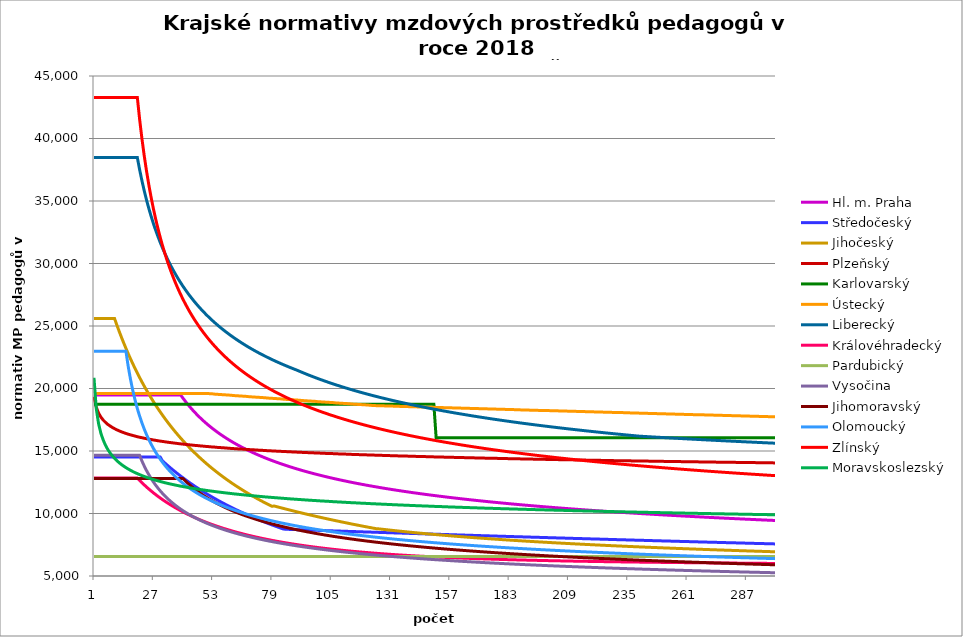
| Category | Hl. m. Praha | Středočeský | Jihočeský | Plzeňský | Karlovarský  | Ústecký   | Liberecký | Královéhradecký | Pardubický | Vysočina | Jihomoravský | Olomoucký | Zlínský | Moravskoslezský |
|---|---|---|---|---|---|---|---|---|---|---|---|---|---|---|
| 0 | 19479.538 | 14525.257 | 25604.931 | 19341.812 | 18733.333 | 19607.702 | 38475.29 | 12832.799 | 6567.12 | 14650.174 | 12794.049 | 22978.421 | 43279.031 | 20856.298 |
| 1 | 19479.538 | 14525.257 | 25604.931 | 18498.733 | 18733.333 | 19607.702 | 38475.29 | 12832.799 | 6567.12 | 14650.174 | 12794.049 | 22978.421 | 43279.031 | 18378.322 |
| 2 | 19479.538 | 14525.257 | 25604.931 | 18032.609 | 18733.333 | 19607.702 | 38475.29 | 12832.799 | 6567.12 | 14650.174 | 12794.049 | 22978.421 | 43279.031 | 17187.135 |
| 3 | 19479.538 | 14525.257 | 25604.931 | 17717.476 | 18733.333 | 19607.702 | 38475.29 | 12832.799 | 6567.12 | 14650.174 | 12794.049 | 22978.421 | 43279.031 | 16434.296 |
| 4 | 19479.538 | 14525.257 | 25604.931 | 17479.885 | 18733.333 | 19607.702 | 38475.29 | 12832.799 | 6567.12 | 14650.174 | 12794.049 | 22978.421 | 43279.031 | 15893.646 |
| 5 | 19479.538 | 14525.257 | 25604.931 | 17297.63 | 18733.333 | 19607.702 | 38475.29 | 12832.799 | 6567.12 | 14650.174 | 12794.049 | 22978.421 | 43279.031 | 15475.208 |
| 6 | 19479.538 | 14525.257 | 25604.931 | 17135.211 | 18733.333 | 19607.702 | 38475.29 | 12832.799 | 6567.12 | 14650.174 | 12794.049 | 22978.421 | 43279.031 | 15136.481 |
| 7 | 19479.538 | 14525.257 | 25604.931 | 17007.456 | 18733.333 | 19607.702 | 38475.29 | 12832.799 | 6567.12 | 14650.174 | 12794.049 | 22978.421 | 43279.031 | 14855.939 |
| 8 | 19479.538 | 14525.257 | 25604.931 | 16889.403 | 18733.333 | 19607.702 | 38475.29 | 12832.799 | 6567.12 | 14650.174 | 12794.049 | 22978.421 | 43279.031 | 14621.891 |
| 9 | 19479.538 | 14525.257 | 25604.931 | 16788.408 | 18733.333 | 19607.702 | 38475.29 | 12832.799 | 6567.12 | 14650.174 | 12794.049 | 22978.421 | 43279.031 | 14412.75 |
| 10 | 19479.538 | 14525.257 | 25088.177 | 16696.249 | 18733.333 | 19607.702 | 38475.29 | 12832.799 | 6567.12 | 14650.174 | 12794.049 | 22978.421 | 43279.031 | 14232.446 |
| 11 | 19479.538 | 14525.257 | 24591.867 | 16612.654 | 18733.333 | 19607.702 | 38475.29 | 12832.799 | 6567.12 | 14650.174 | 12794.049 | 22978.421 | 43279.031 | 14067.81 |
| 12 | 19479.538 | 14525.257 | 24114.814 | 16537.381 | 18733.333 | 19607.702 | 38475.29 | 12832.799 | 6567.12 | 14650.174 | 12794.049 | 22978.421 | 43279.031 | 13923.411 |
| 13 | 19479.538 | 14525.257 | 23655.917 | 16470.217 | 18733.333 | 19607.702 | 38475.29 | 12832.799 | 6567.12 | 14650.174 | 12794.049 | 22978.421 | 43279.031 | 13792.726 |
| 14 | 19479.538 | 14525.257 | 23214.159 | 16403.596 | 18733.333 | 19607.702 | 38475.29 | 12832.799 | 6567.12 | 14650.174 | 12794.049 | 22978.421 | 43279.031 | 13669.767 |
| 15 | 19479.538 | 14525.257 | 22788.597 | 16344.828 | 18733.333 | 19607.702 | 38475.29 | 12832.799 | 6567.12 | 14650.174 | 12794.049 | 21761.495 | 43279.031 | 13559.4 |
| 16 | 19479.538 | 14525.257 | 22378.358 | 16293.75 | 18733.333 | 19607.702 | 38475.29 | 12832.799 | 6567.12 | 14650.174 | 12794.049 | 20740.618 | 43279.031 | 13455.933 |
| 17 | 19479.538 | 14525.257 | 21982.627 | 16242.991 | 18733.333 | 19607.702 | 38475.29 | 12832.799 | 6567.12 | 14650.174 | 12794.049 | 19845 | 43279.031 | 13359.091 |
| 18 | 19479.538 | 14525.257 | 21600.649 | 16192.547 | 18733.333 | 19607.702 | 38475.29 | 12832.799 | 6567.12 | 14650.174 | 12794.049 | 19075.478 | 43279.031 | 13268.623 |
| 19 | 19479.538 | 14525.257 | 21231.72 | 16142.415 | 18733.333 | 19607.702 | 38475.29 | 12832.799 | 6567.12 | 14650.174 | 12794.049 | 18392.417 | 43279.031 | 13189.23 |
| 20 | 19479.538 | 14525.257 | 20875.181 | 16099.691 | 18733.333 | 19607.702 | 37510.962 | 12644.289 | 6567.12 | 14650.174 | 12794.049 | 17792.766 | 41540.661 | 13110.781 |
| 21 | 19479.538 | 14525.257 | 20530.418 | 16064.261 | 18733.333 | 19607.702 | 36635.47 | 12465.749 | 6567.12 | 14206.212 | 12794.049 | 17256.522 | 40008.432 | 13033.259 |
| 22 | 19479.538 | 14525.257 | 20196.859 | 16021.949 | 18733.333 | 19607.702 | 35836.251 | 12292.181 | 6567.12 | 13806.995 | 12794.049 | 16767.739 | 38646.336 | 12966.176 |
| 23 | 19479.538 | 14525.257 | 19873.965 | 15986.859 | 18733.333 | 19607.702 | 35103.059 | 12123.38 | 6567.12 | 13444.745 | 12794.049 | 16328.752 | 37426.384 | 12899.781 |
| 24 | 19479.538 | 14525.257 | 19561.233 | 15951.923 | 18733.333 | 19607.702 | 34427.448 | 11963.308 | 6567.12 | 13114.949 | 12794.049 | 15926.676 | 36326.481 | 12834.061 |
| 25 | 19479.538 | 14525.257 | 19258.19 | 15917.139 | 18733.333 | 19607.702 | 33802.39 | 11811.458 | 6567.12 | 12812.867 | 12794.049 | 15564.706 | 35328.946 | 12773.633 |
| 26 | 19479.538 | 14525.257 | 18964.394 | 15882.507 | 18733.333 | 19607.702 | 33221.985 | 11659.465 | 6567.12 | 12534.922 | 12794.049 | 15225.458 | 34419.453 | 12718.356 |
| 27 | 19479.538 | 14525.257 | 18679.427 | 15854.909 | 18733.333 | 19607.702 | 32681.241 | 11519.036 | 6567.12 | 12278.466 | 12794.049 | 14913.407 | 33586.271 | 12663.555 |
| 28 | 19479.538 | 14525.257 | 18402.898 | 15820.546 | 18733.333 | 19607.702 | 32175.904 | 11378.189 | 6567.12 | 12040.395 | 12794.049 | 14626.131 | 32819.696 | 12613.734 |
| 29 | 19479.538 | 14525.257 | 18134.436 | 15793.163 | 18733.333 | 19607.702 | 31702.323 | 11244.415 | 6567.12 | 11819.185 | 12794.049 | 14355.61 | 32111.627 | 12564.304 |
| 30 | 19479.538 | 14211.256 | 17873.695 | 15765.875 | 18733.333 | 19607.702 | 31257.349 | 11117.339 | 6567.12 | 11613.117 | 12794.049 | 14106.3 | 31455.25 | 12515.259 |
| 31 | 19479.538 | 14048.931 | 17620.345 | 15738.68 | 18733.333 | 19607.702 | 30838.246 | 10993.103 | 6567.12 | 11419.942 | 12794.049 | 13871.009 | 30844.786 | 12466.596 |
| 32 | 19479.538 | 13885.215 | 17374.077 | 15711.58 | 18733.333 | 19607.702 | 30442.629 | 10871.614 | 6567.12 | 11239.089 | 12794.049 | 13648.769 | 30275.304 | 12422.684 |
| 33 | 19479.538 | 13730.212 | 17134.598 | 15684.572 | 18733.333 | 19607.702 | 30068.405 | 10756.139 | 6567.12 | 11068.668 | 12794.049 | 13443.88 | 29742.567 | 12379.08 |
| 34 | 19479.538 | 13573.799 | 16901.631 | 15664.378 | 18733.333 | 19607.702 | 29713.729 | 10643.091 | 6567.12 | 10908.326 | 12794.049 | 13250.076 | 29242.913 | 12340.098 |
| 35 | 19479.538 | 13425.634 | 16674.914 | 15637.532 | 18733.333 | 19607.702 | 29376.972 | 10532.395 | 6567.12 | 10756.767 | 12794.049 | 13066.667 | 28773.162 | 12301.36 |
| 36 | 19479.538 | 13276.045 | 16454.199 | 15617.458 | 18733.333 | 19607.702 | 29056.684 | 10427.135 | 6567.12 | 10613.454 | 12794.049 | 12888.266 | 28330.537 | 12262.865 |
| 37 | 19479.538 | 13134.275 | 16239.251 | 15590.773 | 18733.333 | 19607.702 | 28751.575 | 10327.055 | 6567.12 | 10477.591 | 12794.049 | 12723.934 | 27912.603 | 12224.61 |
| 38 | 19479.538 | 12991.073 | 16029.846 | 15570.819 | 18733.333 | 19607.702 | 28460.49 | 10225.839 | 6567.12 | 10348.455 | 12794.049 | 12568.262 | 27517.211 | 12186.593 |
| 39 | 19227.026 | 12855.293 | 15825.772 | 15550.916 | 18733.333 | 19607.702 | 28182.392 | 10129.568 | 6567.12 | 10225.678 | 12794.049 | 12420.768 | 27142.464 | 12152.998 |
| 40 | 18985.707 | 12718.079 | 15626.83 | 15531.064 | 18733.333 | 19607.702 | 27916.346 | 10038.017 | 6567.12 | 10108.637 | 12615.299 | 12276.696 | 26786.673 | 12119.588 |
| 41 | 18755.974 | 12587.917 | 15432.827 | 15511.262 | 18733.333 | 19607.702 | 27661.511 | 9945.234 | 6567.12 | 9997.037 | 12441.474 | 12140.146 | 26448.337 | 12086.361 |
| 42 | 18536.949 | 12456.321 | 15243.582 | 15491.511 | 18733.333 | 19607.702 | 27417.122 | 9859.794 | 6567.12 | 9890.336 | 12280.721 | 12010.729 | 26126.109 | 12053.315 |
| 43 | 18327.844 | 12331.436 | 15058.922 | 15471.81 | 18733.333 | 19607.702 | 27182.486 | 9773.034 | 6567.12 | 9788.298 | 12124.068 | 11888.087 | 25818.783 | 12024.548 |
| 44 | 18127.948 | 12205.122 | 14878.683 | 15452.159 | 18733.333 | 19607.702 | 26956.974 | 9690.515 | 6567.12 | 9690.707 | 11975.332 | 11767.925 | 25525.273 | 11991.84 |
| 45 | 17936.62 | 12085.198 | 14702.707 | 15439.086 | 18733.333 | 19607.702 | 26740.008 | 9609.378 | 6567.12 | 9596.845 | 11834.076 | 11654.054 | 25244.598 | 11963.365 |
| 46 | 17753.275 | 11963.853 | 14530.845 | 15419.518 | 18733.333 | 19607.702 | 26531.063 | 9532.226 | 6567.12 | 9507.057 | 11699.903 | 11546.182 | 24975.87 | 11935.025 |
| 47 | 17577.386 | 11848.602 | 14362.954 | 15400 | 18733.333 | 19607.702 | 26329.656 | 9456.303 | 6567.12 | 9420.67 | 11568.738 | 11440.288 | 24718.286 | 11906.82 |
| 48 | 17408.469 | 11731.938 | 14198.899 | 15387.015 | 18733.333 | 19607.702 | 26135.344 | 9381.58 | 6567.12 | 9337.545 | 11444.106 | 11340 | 24471.111 | 11882.749 |
| 49 | 17246.084 | 11621.091 | 14038.549 | 15367.579 | 18733.333 | 19607.702 | 25947.719 | 9310.546 | 6567.12 | 9257.311 | 11325.682 | 11245.074 | 24233.677 | 11854.79 |
| 50 | 17089.828 | 11508.844 | 13881.78 | 15354.649 | 18733.333 | 19595.531 | 25766.406 | 9240.58 | 6567.12 | 9180.33 | 11213.164 | 11148.165 | 24005.375 | 11826.962 |
| 51 | 16939.332 | 11402.153 | 13728.474 | 15335.294 | 18733.333 | 19583.375 | 25591.058 | 9171.657 | 6567.12 | 9105.776 | 11102.859 | 11059.911 | 23785.646 | 11803.213 |
| 52 | 16794.256 | 11294.076 | 13578.518 | 15322.418 | 18733.333 | 19571.234 | 25421.354 | 9106.162 | 6567.12 | 9034.021 | 10998.051 | 10973.044 | 23573.975 | 11779.559 |
| 53 | 16654.287 | 11191.312 | 13431.801 | 15309.564 | 18733.333 | 19546.997 | 25256.996 | 9041.597 | 6567.12 | 8964.736 | 10895.204 | 10887.531 | 23369.892 | 11756 |
| 54 | 16519.138 | 11087.177 | 13288.222 | 15290.323 | 18733.333 | 19534.901 | 25097.707 | 8977.94 | 6567.12 | 8897.612 | 10797.489 | 10806.683 | 23172.962 | 11732.535 |
| 55 | 16388.542 | 10988.127 | 13147.679 | 15277.522 | 18733.333 | 19522.82 | 24943.232 | 8917.483 | 6567.12 | 8832.576 | 10701.511 | 10727.027 | 22982.783 | 11709.163 |
| 56 | 16262.252 | 10887.721 | 13010.078 | 15264.743 | 18733.333 | 19510.754 | 24793.332 | 8857.834 | 6567.12 | 8769.774 | 10610.341 | 10651.784 | 22798.985 | 11685.885 |
| 57 | 16140.04 | 10792.188 | 12875.328 | 15251.985 | 18733.333 | 19498.703 | 24647.783 | 8798.978 | 6567.12 | 8708.919 | 10523.776 | 10577.589 | 22621.225 | 11662.698 |
| 58 | 16021.694 | 10695.316 | 12743.34 | 15239.248 | 18733.333 | 19486.667 | 24506.378 | 8743.118 | 6567.12 | 8649.948 | 10438.613 | 10504.421 | 22449.185 | 11643.447 |
| 59 | 15907.017 | 10603.115 | 12614.031 | 15220.183 | 18733.333 | 19474.645 | 24368.923 | 8687.964 | 6567.12 | 8592.596 | 10354.817 | 10435.375 | 22282.569 | 11620.428 |
| 60 | 15795.826 | 10509.592 | 12487.32 | 15207.5 | 18733.333 | 19462.639 | 24235.236 | 8633.501 | 6567.12 | 8537.018 | 10275.277 | 10367.231 | 22121.101 | 11601.316 |
| 61 | 15687.949 | 10420.552 | 12363.129 | 15194.838 | 18733.333 | 19438.67 | 24105.146 | 8579.716 | 6567.12 | 8483.161 | 10199.831 | 10303.009 | 21964.526 | 11578.464 |
| 62 | 15583.228 | 10330.209 | 12241.384 | 15182.196 | 18733.333 | 19426.708 | 23978.493 | 8528.709 | 6567.12 | 8430.575 | 10122.646 | 10239.578 | 21812.605 | 11559.489 |
| 63 | 15481.511 | 10244.17 | 12122.014 | 15169.576 | 18733.333 | 19414.76 | 23855.128 | 8478.306 | 6567.12 | 8379.618 | 10052.213 | 10176.923 | 21665.115 | 11540.576 |
| 64 | 15382.661 | 10156.846 | 12004.949 | 15163.274 | 18733.333 | 19402.827 | 23734.91 | 8430.558 | 6567.12 | 8330.05 | 9979.994 | 10117.961 | 21521.847 | 11521.725 |
| 65 | 15286.545 | 10073.659 | 11890.124 | 15150.685 | 18733.333 | 19390.909 | 23617.705 | 8383.346 | 6567.12 | 8281.831 | 9911.526 | 10059.677 | 21382.607 | 11502.935 |
| 66 | 15193.042 | 9989.206 | 11777.474 | 15138.117 | 18733.333 | 19379.006 | 23503.389 | 8336.659 | 6567.12 | 8234.736 | 9843.99 | 10002.062 | 21247.21 | 11484.207 |
| 67 | 15102.037 | 9908.732 | 11666.939 | 15125.57 | 18733.333 | 19367.117 | 23391.844 | 8290.489 | 6567.12 | 8188.924 | 9780.016 | 9945.103 | 21115.486 | 11465.54 |
| 68 | 15013.42 | 9827.01 | 11558.459 | 15113.043 | 18733.333 | 19343.382 | 23282.958 | 8246.802 | 6567.12 | 8144.36 | 9716.868 | 9891.589 | 20987.272 | 11446.933 |
| 69 | 14927.089 | 9749.118 | 11451.978 | 15100.538 | 18733.333 | 19331.537 | 23176.626 | 8201.62 | 6567.12 | 8100.829 | 9657.112 | 9838.648 | 20862.418 | 11428.386 |
| 70 | 14842.95 | 9669.997 | 11347.441 | 15094.293 | 18733.333 | 19319.706 | 23072.749 | 8160.796 | 6567.12 | 8058.305 | 9595.537 | 9786.271 | 20740.781 | 11413.592 |
| 71 | 14760.911 | 9594.565 | 11244.795 | 15081.818 | 18733.333 | 19307.89 | 22971.232 | 8118.463 | 6567.12 | 8016.945 | 9537.259 | 9737.162 | 20622.226 | 11395.153 |
| 72 | 14680.888 | 9517.923 | 11143.99 | 15069.364 | 18733.333 | 19296.088 | 22871.987 | 8078.461 | 6567.12 | 7976.54 | 9482.174 | 9688.544 | 20506.626 | 11380.445 |
| 73 | 14602.798 | 9444.835 | 11044.975 | 15056.931 | 18733.333 | 19284.301 | 22774.929 | 8038.851 | 6567.12 | 7937.069 | 9425.261 | 9640.409 | 20393.862 | 11362.113 |
| 74 | 14526.567 | 9370.558 | 10947.705 | 15050.722 | 18733.333 | 19272.527 | 22679.977 | 7999.628 | 6567.12 | 7898.509 | 9371.458 | 9592.749 | 20283.82 | 11347.49 |
| 75 | 14452.121 | 9299.707 | 10852.133 | 15038.319 | 18733.333 | 19260.769 | 22587.056 | 7962.627 | 6567.12 | 7860.841 | 9320.671 | 9548.168 | 20176.393 | 11329.264 |
| 76 | 14379.393 | 9227.686 | 10758.216 | 15025.937 | 18733.333 | 19237.294 | 22496.093 | 7924.143 | 6567.12 | 7823.873 | 9268.052 | 9501.415 | 20071.481 | 11314.726 |
| 77 | 14308.318 | 9158.972 | 10665.91 | 15019.753 | 18733.333 | 19225.579 | 22407.02 | 7889.643 | 6567.12 | 7787.929 | 9218.377 | 9457.677 | 19968.987 | 11300.224 |
| 78 | 14238.834 | 9089.106 | 10575.174 | 15007.401 | 18733.333 | 19213.877 | 22319.77 | 7853.65 | 6567.12 | 7752.65 | 9169.231 | 9416.878 | 19868.82 | 11285.76 |
| 79 | 14170.883 | 9022.433 | 10600.315 | 15001.233 | 18733.333 | 19202.19 | 22234.283 | 7817.984 | 6567.12 | 7718.188 | 9122.91 | 9373.913 | 19770.895 | 11271.333 |
| 80 | 14104.41 | 8954.627 | 10551.577 | 14988.912 | 18733.333 | 19190.517 | 22150.497 | 7784.4 | 6567.12 | 7684.362 | 9074.774 | 9333.832 | 19675.128 | 11256.942 |
| 81 | 14039.362 | 8889.904 | 10503.285 | 14982.759 | 18733.333 | 19178.858 | 22068.357 | 7751.103 | 6567.12 | 7651.322 | 9029.4 | 9291.62 | 19581.444 | 11242.588 |
| 82 | 13975.689 | 8824.069 | 10455.433 | 14970.468 | 18733.333 | 19167.213 | 21987.809 | 7719.821 | 6567.12 | 7618.889 | 8984.478 | 9252.238 | 19489.766 | 11228.271 |
| 83 | 13913.343 | 8761.213 | 10408.015 | 14964.33 | 18733.333 | 19143.966 | 21908.801 | 7687.073 | 6567.12 | 7587.213 | 8942.213 | 9215.62 | 19400.026 | 11213.99 |
| 84 | 13852.279 | 8739.124 | 10361.025 | 14952.069 | 18733.333 | 19132.364 | 21831.284 | 7656.304 | 6567.12 | 7556.119 | 8898.152 | 9176.879 | 19312.156 | 11199.746 |
| 85 | 13792.453 | 8733.12 | 10314.458 | 14945.946 | 18733.333 | 19120.775 | 21755.21 | 7625.781 | 6567.12 | 7525.595 | 8856.694 | 9140.853 | 19226.093 | 11185.538 |
| 86 | 13733.825 | 8727.123 | 10268.307 | 14933.715 | 18733.333 | 19109.201 | 21680.535 | 7595.5 | 6567.12 | 7495.631 | 8815.621 | 9102.737 | 19141.775 | 11171.365 |
| 87 | 13676.355 | 8721.134 | 10222.567 | 14927.607 | 18733.333 | 19097.641 | 21607.216 | 7567.121 | 6567.12 | 7466.372 | 8774.927 | 9067.29 | 19059.144 | 11157.229 |
| 88 | 13620.005 | 8715.154 | 10177.233 | 14915.407 | 18733.333 | 19086.094 | 21535.211 | 7538.953 | 6567.12 | 7437.649 | 8736.72 | 9032.118 | 18978.145 | 11146.65 |
| 89 | 13564.739 | 8707.193 | 10132.3 | 14909.314 | 18733.333 | 19074.562 | 21464.481 | 7510.995 | 6567.12 | 7409.454 | 8698.844 | 8999.536 | 18898.726 | 11132.576 |
| 90 | 13510.523 | 8701.232 | 10087.761 | 14903.226 | 18733.333 | 19063.043 | 21385.963 | 7483.243 | 6567.12 | 7381.625 | 8659.218 | 8964.887 | 18820.835 | 11118.537 |
| 91 | 13457.325 | 8695.279 | 10043.612 | 14891.065 | 18733.333 | 19040.048 | 21308.867 | 7455.695 | 6567.12 | 7354.457 | 8624.069 | 8932.788 | 18744.425 | 11108.031 |
| 92 | 13405.112 | 8689.335 | 9999.848 | 14884.992 | 18733.333 | 19028.571 | 21233.149 | 7429.953 | 6567.12 | 7327.788 | 8587.161 | 8900.917 | 18669.448 | 11094.055 |
| 93 | 13353.855 | 8683.398 | 9956.464 | 14878.924 | 18733.333 | 19017.108 | 21158.768 | 7404.387 | 6567.12 | 7301.611 | 8550.568 | 8867.022 | 18595.861 | 11083.595 |
| 94 | 13303.525 | 8677.469 | 9913.455 | 14866.802 | 18733.333 | 19005.659 | 21085.685 | 7378.997 | 6567.12 | 7275.767 | 8516.293 | 8835.619 | 18523.622 | 11069.68 |
| 95 | 13254.093 | 8671.549 | 9870.815 | 14860.749 | 18733.333 | 18994.224 | 21013.864 | 7353.78 | 6567.12 | 7250.547 | 8482.292 | 8806.657 | 18452.69 | 11059.266 |
| 96 | 13205.535 | 8663.667 | 9828.541 | 14854.701 | 18733.333 | 18982.802 | 20943.266 | 7330.296 | 6567.12 | 7225.647 | 8448.561 | 8775.678 | 18383.025 | 11045.412 |
| 97 | 13157.823 | 8657.766 | 9786.627 | 14842.619 | 18733.333 | 18971.394 | 20873.858 | 7305.411 | 6567.12 | 7201.063 | 8415.098 | 8744.917 | 18314.591 | 11035.044 |
| 98 | 13110.934 | 8651.872 | 9745.07 | 14836.585 | 18733.333 | 18948.619 | 20805.606 | 7282.234 | 6567.12 | 7177.077 | 8381.898 | 8716.546 | 18247.352 | 11024.695 |
| 99 | 13064.844 | 8645.986 | 9703.864 | 14830.557 | 18733.333 | 18937.253 | 20738.479 | 7259.203 | 6567.12 | 7153.394 | 8350.89 | 8688.358 | 18181.273 | 11010.927 |
| 100 | 13019.532 | 8640.109 | 9663.004 | 14824.533 | 18733.333 | 18925.899 | 20672.445 | 7237.839 | 6567.12 | 7130.151 | 8320.111 | 8660.352 | 18116.321 | 11000.624 |
| 101 | 12974.974 | 8634.239 | 9622.488 | 14812.5 | 18733.333 | 18914.56 | 20607.474 | 7215.088 | 6567.12 | 7107.34 | 8287.655 | 8632.526 | 18052.465 | 10990.34 |
| 102 | 12931.15 | 8628.377 | 9582.309 | 14806.491 | 18733.333 | 18903.234 | 20543.539 | 7193.982 | 6567.12 | 7084.816 | 8257.339 | 8604.878 | 17989.674 | 10980.075 |
| 103 | 12888.041 | 8620.574 | 9542.465 | 14800.487 | 18733.333 | 18891.921 | 20480.611 | 7173 | 6567.12 | 7062.573 | 8229.118 | 8577.407 | 17927.918 | 10969.829 |
| 104 | 12845.626 | 8614.731 | 9502.951 | 14794.487 | 18733.333 | 18880.622 | 20418.664 | 7152.14 | 6567.12 | 7040.746 | 8199.228 | 8552.204 | 17867.17 | 10956.198 |
| 105 | 12803.888 | 8608.896 | 9463.763 | 14788.493 | 18733.333 | 18869.337 | 20357.672 | 7131.4 | 6567.12 | 7019.33 | 8169.554 | 8525.067 | 17807.403 | 10945.996 |
| 106 | 12762.808 | 8603.069 | 9424.897 | 14776.518 | 18733.333 | 18846.806 | 20297.612 | 7112.25 | 6567.12 | 6998.18 | 8141.93 | 8500.17 | 17748.589 | 10935.814 |
| 107 | 12722.37 | 8597.249 | 9386.348 | 14770.538 | 18733.333 | 18835.561 | 20238.458 | 7093.201 | 6567.12 | 6977.294 | 8114.491 | 8473.362 | 17690.705 | 10925.651 |
| 108 | 12682.556 | 8591.438 | 9348.114 | 14764.563 | 18733.333 | 18824.329 | 20180.189 | 7072.802 | 6567.12 | 6956.802 | 8087.237 | 8448.766 | 17633.725 | 10915.506 |
| 109 | 12643.351 | 8583.701 | 9310.19 | 14758.593 | 18733.333 | 18813.111 | 20122.782 | 7055.41 | 6567.12 | 6936.7 | 8060.165 | 8424.313 | 17577.626 | 10905.38 |
| 110 | 12604.739 | 8577.908 | 9272.572 | 14752.627 | 18733.333 | 18801.906 | 20066.216 | 7036.665 | 6567.12 | 6916.713 | 8033.274 | 8400 | 17522.386 | 10895.273 |
| 111 | 12566.706 | 8572.122 | 9235.257 | 14746.667 | 18733.333 | 18790.714 | 20010.47 | 7018.019 | 6567.12 | 6897.108 | 8006.562 | 8375.827 | 17467.983 | 10885.185 |
| 112 | 12529.236 | 8566.345 | 9198.241 | 14740.711 | 18733.333 | 18779.536 | 19955.524 | 7000.895 | 6567.12 | 6877.745 | 7980.027 | 8353.791 | 17414.396 | 10875.116 |
| 113 | 12492.316 | 8560.575 | 9161.521 | 14728.814 | 18733.333 | 18757.219 | 19901.36 | 6983.854 | 6567.12 | 6858.754 | 7955.419 | 8329.883 | 17361.605 | 10865.065 |
| 114 | 12455.933 | 8554.813 | 9125.093 | 14722.872 | 18733.333 | 18746.081 | 19847.957 | 6965.487 | 6567.12 | 6839.998 | 7930.962 | 8308.088 | 17309.589 | 10858.374 |
| 115 | 12420.073 | 8549.058 | 9088.953 | 14716.935 | 18733.333 | 18734.955 | 19795.3 | 6950.02 | 6567.12 | 6821.474 | 7904.924 | 8284.44 | 17258.331 | 10848.354 |
| 116 | 12384.725 | 8541.398 | 9053.098 | 14711.004 | 18733.333 | 18723.843 | 19743.369 | 6933.226 | 6567.12 | 6803.18 | 7880.777 | 8262.881 | 17207.811 | 10838.353 |
| 117 | 12349.875 | 8535.662 | 9017.526 | 14705.077 | 18733.333 | 18712.745 | 19692.149 | 6916.513 | 6567.12 | 6785.241 | 7856.776 | 8241.435 | 17158.013 | 10828.37 |
| 118 | 12315.512 | 8529.933 | 8982.231 | 14699.154 | 18733.333 | 18701.659 | 19641.623 | 6901.263 | 6567.12 | 6767.397 | 7834.62 | 8220.099 | 17108.918 | 10818.405 |
| 119 | 12281.626 | 8524.212 | 8947.212 | 14693.237 | 18733.333 | 18690.586 | 19591.775 | 6886.08 | 6567.12 | 6749.901 | 7810.9 | 8198.873 | 17060.511 | 10811.772 |
| 120 | 12248.204 | 8518.499 | 8912.465 | 14687.324 | 18733.333 | 18679.527 | 19542.589 | 6870.964 | 6567.12 | 6732.622 | 7787.322 | 8177.757 | 17012.776 | 10801.838 |
| 121 | 12215.237 | 8512.793 | 8877.987 | 14681.416 | 18733.333 | 18657.447 | 19494.052 | 6855.914 | 6567.12 | 6715.557 | 7765.556 | 8156.749 | 16965.696 | 10791.922 |
| 122 | 12182.713 | 8507.095 | 8843.774 | 14675.513 | 18733.333 | 18646.426 | 19446.149 | 6840.93 | 6567.12 | 6698.704 | 7742.251 | 8135.849 | 16919.258 | 10782.024 |
| 123 | 12150.624 | 8499.51 | 8809.824 | 14669.614 | 18733.333 | 18635.419 | 19398.866 | 6826.011 | 6567.12 | 6682.06 | 7720.735 | 8115.056 | 16873.446 | 10775.435 |
| 124 | 12118.959 | 8493.829 | 8776.134 | 14663.72 | 18733.333 | 18624.425 | 19352.189 | 6812.505 | 6567.12 | 6665.747 | 7699.339 | 8096.245 | 16828.246 | 10765.568 |
| 125 | 12087.708 | 8488.157 | 8769.207 | 14657.831 | 18733.333 | 18624.425 | 19306.105 | 6799.052 | 6567.12 | 6649.514 | 7678.061 | 8075.653 | 16783.645 | 10758.999 |
| 126 | 12056.864 | 8482.492 | 8748.129 | 14651.947 | 18733.333 | 18613.443 | 19260.602 | 6784.315 | 6567.12 | 6633.605 | 7656.901 | 8057.024 | 16739.63 | 10749.162 |
| 127 | 12026.417 | 8476.834 | 8727.316 | 14646.067 | 18733.333 | 18613.443 | 19215.668 | 6770.973 | 6567.12 | 6617.773 | 7635.856 | 8036.631 | 16696.188 | 10739.342 |
| 128 | 11996.358 | 8471.184 | 8706.763 | 14640.193 | 18733.333 | 18602.475 | 19171.29 | 6757.684 | 6567.12 | 6602.137 | 7614.927 | 8018.182 | 16653.305 | 10732.806 |
| 129 | 11966.68 | 8463.663 | 8686.464 | 14634.322 | 18733.333 | 18602.475 | 19127.457 | 6745.768 | 6567.12 | 6586.818 | 7595.71 | 7999.817 | 16610.972 | 10723.016 |
| 130 | 11937.374 | 8458.03 | 8666.414 | 14628.457 | 18733.333 | 18591.519 | 19084.157 | 6732.577 | 6567.12 | 6571.57 | 7575 | 7981.536 | 16569.175 | 10716.5 |
| 131 | 11908.432 | 8452.405 | 8646.607 | 14622.596 | 18733.333 | 18591.519 | 19041.38 | 6720.75 | 6567.12 | 6556.513 | 7555.983 | 7963.338 | 16527.903 | 10706.74 |
| 132 | 11879.847 | 8446.788 | 8627.04 | 14616.74 | 18733.333 | 18580.577 | 18999.115 | 6707.656 | 6567.12 | 6541.763 | 7535.489 | 7945.223 | 16487.145 | 10700.243 |
| 133 | 11851.612 | 8441.178 | 8607.706 | 14610.889 | 18733.333 | 18580.577 | 18957.352 | 6695.916 | 6567.12 | 6527.08 | 7516.67 | 7927.19 | 16446.891 | 10690.512 |
| 134 | 11823.719 | 8435.575 | 8588.602 | 14605.042 | 18733.333 | 18569.647 | 18916.08 | 6684.217 | 6567.12 | 6512.581 | 7497.945 | 7909.239 | 16407.13 | 10684.035 |
| 135 | 11796.161 | 8429.98 | 8569.722 | 14599.2 | 18733.333 | 18569.647 | 18875.29 | 6672.558 | 6567.12 | 6498.265 | 7479.312 | 7893.153 | 16367.853 | 10674.334 |
| 136 | 11768.932 | 8422.531 | 8551.063 | 14599.2 | 18733.333 | 18558.73 | 18834.973 | 6660.94 | 6567.12 | 6484.129 | 7460.773 | 7875.355 | 16329.048 | 10667.877 |
| 137 | 11742.025 | 8416.954 | 8532.619 | 14593.363 | 18733.333 | 18558.73 | 18795.119 | 6650.647 | 6567.12 | 6470.171 | 7442.324 | 7857.638 | 16290.708 | 10661.427 |
| 138 | 11715.434 | 8411.383 | 8514.387 | 14587.53 | 18733.333 | 18547.826 | 18755.719 | 6639.105 | 6567.12 | 6456.273 | 7423.967 | 7841.76 | 16252.822 | 10651.767 |
| 139 | 11689.152 | 8405.82 | 8496.363 | 14581.702 | 18733.333 | 18547.826 | 18716.765 | 6628.879 | 6567.12 | 6442.667 | 7405.7 | 7824.194 | 16215.381 | 10645.337 |
| 140 | 11663.174 | 8400.264 | 8478.543 | 14575.879 | 18733.333 | 18536.935 | 18678.248 | 6618.685 | 6567.12 | 6429.118 | 7389.034 | 7808.451 | 16178.377 | 10638.914 |
| 141 | 11637.493 | 8394.716 | 8460.922 | 14570.06 | 18733.333 | 18536.935 | 18640.159 | 6607.254 | 6567.12 | 6415.741 | 7370.939 | 7792.771 | 16141.802 | 10629.295 |
| 142 | 11612.104 | 8389.175 | 8443.497 | 14564.246 | 18733.333 | 18526.056 | 18602.492 | 6597.126 | 6567.12 | 6402.535 | 7352.932 | 7775.423 | 16105.646 | 10622.892 |
| 143 | 11587.002 | 8381.798 | 8426.264 | 14558.436 | 18733.333 | 18526.056 | 18565.237 | 6587.029 | 6567.12 | 6389.496 | 7336.502 | 7759.876 | 16069.902 | 10616.496 |
| 144 | 11562.18 | 8376.274 | 8409.22 | 14552.632 | 18733.333 | 18515.191 | 18528.387 | 6578.219 | 6567.12 | 6376.511 | 7320.146 | 7744.39 | 16034.563 | 10606.917 |
| 145 | 11537.634 | 8370.757 | 8392.362 | 14552.632 | 18733.333 | 18515.191 | 18491.935 | 6568.18 | 6567.12 | 6363.805 | 7302.386 | 7728.967 | 15999.619 | 10600.541 |
| 146 | 11513.359 | 8365.248 | 8375.685 | 14546.831 | 18733.333 | 18504.338 | 18455.873 | 6558.171 | 6567.12 | 6351.149 | 7286.181 | 7713.604 | 15965.065 | 10594.172 |
| 147 | 11489.349 | 8359.746 | 8359.187 | 14541.036 | 18733.333 | 18504.338 | 18420.195 | 6549.439 | 6567.12 | 6338.656 | 7270.048 | 7698.303 | 15930.892 | 10587.811 |
| 148 | 11465.6 | 8354.251 | 8342.864 | 14535.245 | 18733.333 | 18493.497 | 18384.894 | 6539.487 | 6567.12 | 6326.212 | 7253.987 | 7683.062 | 15897.094 | 10578.284 |
| 149 | 11442.106 | 8346.935 | 8326.713 | 14529.459 | 18733.333 | 18493.497 | 18349.962 | 6530.804 | 6567.12 | 6314.039 | 7237.996 | 7667.881 | 15863.664 | 10571.942 |
| 150 | 11418.864 | 8341.457 | 8310.732 | 14523.677 | 16057.143 | 18482.67 | 18315.394 | 6522.144 | 6567.12 | 6301.913 | 7222.076 | 7654.438 | 15830.594 | 10565.608 |
| 151 | 11395.868 | 8335.986 | 8294.916 | 14523.677 | 16057.143 | 18482.67 | 18281.182 | 6513.507 | 6567.12 | 6289.834 | 7206.225 | 7639.37 | 15797.88 | 10559.281 |
| 152 | 11373.115 | 8330.522 | 8279.264 | 14517.9 | 16057.143 | 18471.855 | 18247.321 | 6504.893 | 6567.12 | 6278.022 | 7191.876 | 7624.361 | 15765.513 | 10552.962 |
| 153 | 11350.6 | 8325.066 | 8263.772 | 14512.127 | 16057.143 | 18471.855 | 18213.805 | 6496.302 | 6567.12 | 6266.253 | 7176.157 | 7611.07 | 15733.488 | 10546.651 |
| 154 | 11328.318 | 8319.616 | 8248.438 | 14506.359 | 16057.143 | 18461.053 | 18180.627 | 6487.733 | 6567.12 | 6254.638 | 7160.508 | 7596.172 | 15701.799 | 10540.347 |
| 155 | 11306.267 | 8314.174 | 8233.258 | 14500.596 | 16057.143 | 18461.053 | 18147.783 | 6480.407 | 6567.12 | 6243.175 | 7146.34 | 7582.979 | 15670.441 | 10530.905 |
| 156 | 11284.441 | 8306.928 | 8218.231 | 14500.596 | 16057.143 | 18450.263 | 18115.265 | 6471.88 | 6567.12 | 6231.754 | 7130.819 | 7568.191 | 15639.406 | 10524.62 |
| 157 | 11262.837 | 8301.502 | 8203.353 | 14494.837 | 16057.143 | 18450.263 | 18083.069 | 6464.589 | 6567.12 | 6220.483 | 7116.768 | 7555.094 | 15608.69 | 10518.342 |
| 158 | 11241.451 | 8296.084 | 8188.623 | 14489.083 | 16057.143 | 18439.486 | 18051.19 | 6457.314 | 6567.12 | 6209.253 | 7102.773 | 7542.043 | 15578.287 | 10512.072 |
| 159 | 11220.279 | 8290.672 | 8174.037 | 14483.333 | 16057.143 | 18439.486 | 18019.621 | 6448.848 | 6567.12 | 6198.278 | 7087.441 | 7527.414 | 15548.191 | 10505.809 |
| 160 | 11199.319 | 8285.267 | 8159.593 | 14477.588 | 16057.143 | 18439.486 | 17988.358 | 6441.609 | 6567.12 | 6187.234 | 7073.561 | 7514.458 | 15518.399 | 10499.553 |
| 161 | 11178.565 | 8279.87 | 8145.29 | 14477.588 | 16057.143 | 18428.722 | 17957.396 | 6434.386 | 6567.12 | 6176.443 | 7059.734 | 7501.546 | 15488.903 | 10493.306 |
| 162 | 11158.016 | 8274.479 | 8131.124 | 14471.848 | 16057.143 | 18428.722 | 17926.731 | 6427.179 | 6567.12 | 6165.69 | 7045.962 | 7488.679 | 15459.7 | 10487.065 |
| 163 | 11137.666 | 8267.303 | 8117.093 | 14466.112 | 16057.143 | 18417.97 | 17896.356 | 6419.989 | 6567.12 | 6155.08 | 7032.243 | 7475.856 | 15430.784 | 10480.832 |
| 164 | 11117.514 | 8261.928 | 8103.196 | 14460.38 | 16057.143 | 18417.97 | 17866.268 | 6412.814 | 6567.12 | 6144.506 | 7018.578 | 7463.077 | 15402.152 | 10474.606 |
| 165 | 11097.556 | 8256.561 | 8089.429 | 14460.38 | 16057.143 | 18407.23 | 17836.461 | 6406.848 | 6567.12 | 6134.074 | 7004.965 | 7450.341 | 15373.797 | 10468.388 |
| 166 | 11077.788 | 8251.201 | 8075.792 | 14454.653 | 16057.143 | 18407.23 | 17806.932 | 6399.703 | 6567.12 | 6123.677 | 6991.405 | 7437.649 | 15345.716 | 10462.177 |
| 167 | 11058.208 | 8245.848 | 8062.281 | 14448.931 | 16057.143 | 18396.503 | 17777.677 | 6392.573 | 6567.12 | 6113.525 | 6977.898 | 7425 | 15317.904 | 10455.974 |
| 168 | 11038.813 | 8240.501 | 8048.896 | 14443.213 | 16057.143 | 18396.503 | 17748.689 | 6386.644 | 6567.12 | 6103.302 | 6965.786 | 7412.394 | 15290.357 | 10449.778 |
| 169 | 11019.6 | 8233.384 | 8035.633 | 14443.213 | 16057.143 | 18385.789 | 17719.967 | 6380.726 | 6567.12 | 6093.32 | 6952.377 | 7399.831 | 15263.07 | 10443.589 |
| 170 | 11000.565 | 8228.054 | 8022.492 | 14437.5 | 16057.143 | 18385.789 | 17691.505 | 6373.639 | 6567.12 | 6083.268 | 6939.02 | 7388.872 | 15236.04 | 10437.408 |
| 171 | 10981.707 | 8222.73 | 8009.469 | 14431.791 | 16057.143 | 18375.087 | 17663.299 | 6367.746 | 6567.12 | 6073.455 | 6927.043 | 7376.389 | 15209.262 | 10431.233 |
| 172 | 10963.022 | 8217.414 | 7996.564 | 14426.087 | 16057.143 | 18375.087 | 17635.346 | 6361.863 | 6567.12 | 6063.674 | 6913.783 | 7363.947 | 15182.732 | 10425.067 |
| 173 | 10944.507 | 8212.104 | 7983.774 | 14426.087 | 16057.143 | 18364.398 | 17607.641 | 6355.99 | 6567.12 | 6053.924 | 6901.892 | 7353.095 | 15156.447 | 10421.986 |
| 174 | 10926.161 | 8206.802 | 7971.099 | 14420.387 | 16057.143 | 18364.398 | 17580.182 | 6350.129 | 6567.12 | 6044.308 | 6888.728 | 7340.731 | 15130.403 | 10415.83 |
| 175 | 10907.979 | 8201.506 | 7958.535 | 14414.692 | 16057.143 | 18353.721 | 17552.964 | 6344.279 | 6567.12 | 6034.824 | 6876.923 | 7329.948 | 15104.596 | 10409.681 |
| 176 | 10889.961 | 8194.455 | 7946.082 | 14414.692 | 16057.143 | 18353.721 | 17525.983 | 6338.439 | 6567.12 | 6025.369 | 6865.159 | 7317.662 | 15079.022 | 10403.54 |
| 177 | 10872.103 | 8189.175 | 7933.737 | 14409.001 | 16057.143 | 18343.056 | 17499.236 | 6332.61 | 6567.12 | 6016.046 | 6852.134 | 7306.946 | 15053.678 | 10397.406 |
| 178 | 10854.404 | 8183.902 | 7921.5 | 14403.315 | 16057.143 | 18343.056 | 17472.721 | 6327.954 | 6567.12 | 6006.751 | 6840.455 | 7294.737 | 15028.56 | 10391.279 |
| 179 | 10836.86 | 8178.636 | 7909.368 | 14403.315 | 16057.143 | 18332.404 | 17446.432 | 6322.145 | 6567.12 | 5997.485 | 6828.815 | 7284.088 | 15003.665 | 10385.159 |
| 180 | 10819.469 | 8173.376 | 7897.34 | 14397.633 | 16057.143 | 18332.404 | 17420.367 | 6316.346 | 6567.12 | 5988.448 | 6817.214 | 7273.469 | 14978.99 | 10382.102 |
| 181 | 10802.229 | 8168.123 | 7885.414 | 14391.956 | 16057.143 | 18321.764 | 17394.524 | 6311.714 | 6567.12 | 5979.338 | 6805.653 | 7261.372 | 14954.531 | 10375.993 |
| 182 | 10785.138 | 8162.877 | 7873.59 | 14386.283 | 16057.143 | 18321.764 | 17368.897 | 6305.934 | 6567.12 | 5970.356 | 6794.131 | 7250.82 | 14930.285 | 10369.891 |
| 183 | 10768.194 | 8155.893 | 7861.865 | 14386.283 | 16057.143 | 18311.137 | 17343.486 | 6301.318 | 6567.12 | 5961.499 | 6782.648 | 7240.299 | 14906.249 | 10363.797 |
| 184 | 10751.395 | 8150.663 | 7850.239 | 14380.615 | 16057.143 | 18311.137 | 17318.285 | 6296.708 | 6567.12 | 5952.669 | 6771.204 | 7229.807 | 14882.42 | 10357.709 |
| 185 | 10734.738 | 8145.439 | 7838.709 | 14374.951 | 16057.143 | 18300.522 | 17293.293 | 6290.956 | 6567.12 | 5943.964 | 6759.798 | 7219.347 | 14858.795 | 10354.668 |
| 186 | 10718.221 | 8140.222 | 7827.274 | 14374.951 | 16057.143 | 18300.522 | 17268.506 | 6286.361 | 6567.12 | 5935.285 | 6749.692 | 7208.916 | 14835.371 | 10348.592 |
| 187 | 10701.843 | 8135.012 | 7815.934 | 14369.291 | 16057.143 | 18289.919 | 17243.922 | 6281.773 | 6567.12 | 5926.729 | 6738.358 | 7198.516 | 14812.145 | 10342.522 |
| 188 | 10685.601 | 8129.808 | 7804.686 | 14363.636 | 16057.143 | 18289.919 | 17219.538 | 6277.192 | 6567.12 | 5918.197 | 6727.063 | 7188.146 | 14789.114 | 10336.46 |
| 189 | 10669.494 | 8122.88 | 7793.529 | 14363.636 | 16057.143 | 18279.328 | 17195.351 | 6272.618 | 6567.12 | 5909.69 | 6717.054 | 7177.805 | 14766.276 | 10333.431 |
| 190 | 10653.519 | 8117.692 | 7782.463 | 14357.986 | 16057.143 | 18279.328 | 17171.358 | 6268.05 | 6567.12 | 5901.305 | 6705.83 | 7167.494 | 14743.627 | 10327.379 |
| 191 | 10637.676 | 8112.511 | 7771.486 | 14352.34 | 16057.143 | 18268.75 | 17147.556 | 6263.489 | 6567.12 | 5892.944 | 6694.643 | 7157.213 | 14721.166 | 10321.335 |
| 192 | 10621.961 | 8107.336 | 7760.596 | 14352.34 | 16057.143 | 18268.75 | 17123.944 | 6258.935 | 6567.12 | 5884.703 | 6684.731 | 7146.961 | 14698.889 | 10318.315 |
| 193 | 10606.374 | 8102.167 | 7749.793 | 14346.698 | 16057.143 | 18258.184 | 17100.518 | 6254.387 | 6567.12 | 5876.485 | 6673.614 | 7136.739 | 14676.794 | 10312.281 |
| 194 | 10590.911 | 8097.006 | 7739.075 | 14346.698 | 16057.143 | 18258.184 | 17077.276 | 6250.98 | 6567.12 | 5868.386 | 6663.764 | 7128 | 14654.878 | 10306.254 |
| 195 | 10575.573 | 8091.851 | 7728.442 | 14341.061 | 16057.143 | 18247.63 | 17054.216 | 6246.444 | 6567.12 | 5860.31 | 6653.943 | 7117.832 | 14633.139 | 10303.243 |
| 196 | 10560.357 | 8084.987 | 7717.891 | 14335.428 | 16057.143 | 18247.63 | 17031.334 | 6241.914 | 6567.12 | 5852.351 | 6642.928 | 7107.692 | 14611.575 | 10297.226 |
| 197 | 10545.261 | 8079.847 | 7707.423 | 14335.428 | 16057.143 | 18247.63 | 17008.63 | 6238.521 | 6567.12 | 5844.414 | 6633.168 | 7097.582 | 14590.183 | 10291.217 |
| 198 | 10530.284 | 8074.714 | 7697.035 | 14329.8 | 16057.143 | 18237.088 | 16986.1 | 6234.003 | 6567.12 | 5836.499 | 6623.437 | 7088.939 | 14568.961 | 10288.215 |
| 199 | 10515.425 | 8069.587 | 7686.728 | 14324.176 | 16057.143 | 18237.088 | 16963.741 | 6230.619 | 6567.12 | 5828.7 | 6612.523 | 7078.881 | 14547.907 | 10282.216 |
| 200 | 10500.681 | 8064.467 | 7676.499 | 14324.176 | 16057.143 | 18226.559 | 16941.553 | 6226.112 | 6567.12 | 5820.922 | 6602.852 | 7070.283 | 14527.017 | 10276.224 |
| 201 | 10486.051 | 8059.353 | 7666.347 | 14318.556 | 16057.143 | 18226.559 | 16919.532 | 6222.736 | 6567.12 | 5813.259 | 6593.209 | 7060.279 | 14506.291 | 10273.23 |
| 202 | 10471.534 | 8054.246 | 7656.273 | 14318.556 | 16057.143 | 18216.042 | 16897.677 | 6219.364 | 6567.12 | 5805.616 | 6583.595 | 7051.726 | 14485.726 | 10267.249 |
| 203 | 10457.128 | 8047.446 | 7646.274 | 14312.941 | 16057.143 | 18216.042 | 16875.985 | 6214.874 | 6567.12 | 5797.993 | 6574.008 | 7041.774 | 14465.32 | 10261.274 |
| 204 | 10442.831 | 8042.354 | 7636.35 | 14307.33 | 16057.143 | 18205.536 | 16854.455 | 6211.51 | 6567.12 | 5790.484 | 6564.449 | 7033.266 | 14445.07 | 10258.29 |
| 205 | 10428.643 | 8037.268 | 7626.5 | 14307.33 | 16057.143 | 18205.536 | 16833.084 | 6208.15 | 6567.12 | 5782.995 | 6554.918 | 7023.366 | 14424.976 | 10252.326 |
| 206 | 10414.562 | 8032.189 | 7616.723 | 14301.724 | 16057.143 | 18195.043 | 16811.87 | 6204.794 | 6567.12 | 5775.618 | 6545.415 | 7014.903 | 14405.034 | 10249.346 |
| 207 | 10400.587 | 8027.116 | 7607.017 | 14296.122 | 16057.143 | 18195.043 | 16790.811 | 6200.324 | 6567.12 | 5768.259 | 6535.939 | 7005.054 | 14385.242 | 10243.392 |
| 208 | 10386.716 | 8022.049 | 7597.383 | 14296.122 | 16057.143 | 18184.562 | 16769.905 | 6196.976 | 6567.12 | 5760.92 | 6526.491 | 6996.635 | 14365.6 | 10237.446 |
| 209 | 10372.947 | 8015.304 | 7587.819 | 14290.525 | 16057.143 | 18184.562 | 16749.151 | 6193.632 | 6567.12 | 5753.692 | 6517.07 | 6988.235 | 14346.105 | 10234.475 |
| 210 | 10359.28 | 8010.252 | 7578.324 | 14290.525 | 16057.143 | 18174.093 | 16728.547 | 6190.291 | 6567.12 | 5746.482 | 6508.848 | 6979.856 | 14326.754 | 10228.538 |
| 211 | 10345.714 | 8005.207 | 7568.898 | 14284.932 | 16057.143 | 18174.093 | 16708.09 | 6186.954 | 6567.12 | 5739.382 | 6499.478 | 6970.106 | 14307.547 | 10225.573 |
| 212 | 10332.247 | 8000.168 | 7559.54 | 14284.932 | 16057.143 | 18163.636 | 16687.779 | 6183.621 | 6567.12 | 5732.299 | 6490.135 | 6961.77 | 14288.481 | 10219.646 |
| 213 | 10318.877 | 7995.135 | 7550.248 | 14279.343 | 16057.143 | 18163.636 | 16667.612 | 6181.4 | 6567.12 | 5725.234 | 6480.818 | 6953.454 | 14269.555 | 10216.686 |
| 214 | 10305.604 | 7990.109 | 7541.022 | 14273.758 | 16057.143 | 18153.191 | 16647.588 | 6178.073 | 6567.12 | 5718.186 | 6472.688 | 6945.158 | 14250.767 | 10210.77 |
| 215 | 10292.427 | 7985.089 | 7531.861 | 14273.758 | 16057.143 | 18153.191 | 16627.704 | 6174.749 | 6567.12 | 5711.247 | 6463.422 | 6936.882 | 14232.116 | 10206.678 |
| 216 | 10279.344 | 7978.406 | 7522.765 | 14268.178 | 16057.143 | 18142.759 | 16607.959 | 6171.429 | 6567.12 | 5704.416 | 6455.335 | 6928.625 | 14213.598 | 10202.202 |
| 217 | 10266.354 | 7973.4 | 7513.732 | 14268.178 | 16057.143 | 18142.759 | 16588.352 | 6168.112 | 6567.12 | 5697.51 | 6446.118 | 6920.388 | 14195.214 | 10197.75 |
| 218 | 10253.456 | 7968.401 | 7504.762 | 14262.603 | 16057.143 | 18132.338 | 16568.88 | 6165.903 | 6567.12 | 5690.712 | 6438.075 | 6912.171 | 14176.961 | 10193.323 |
| 219 | 10240.649 | 7963.409 | 7495.855 | 14257.031 | 16057.143 | 18132.338 | 16549.542 | 6162.592 | 6567.12 | 5683.93 | 6428.907 | 6903.973 | 14158.838 | 10188.919 |
| 220 | 10227.932 | 7958.422 | 7487.008 | 14257.031 | 16057.143 | 18121.929 | 16530.336 | 6159.284 | 6567.12 | 5677.253 | 6420.907 | 6895.795 | 14140.843 | 10184.54 |
| 221 | 10215.303 | 7953.442 | 7478.223 | 14251.464 | 16057.143 | 18121.929 | 16511.262 | 6157.082 | 6567.12 | 5670.593 | 6411.788 | 6887.636 | 14122.974 | 10180.184 |
| 222 | 10202.762 | 7948.468 | 7469.497 | 14251.464 | 16057.143 | 18111.532 | 16492.317 | 6153.78 | 6567.12 | 5663.948 | 6403.83 | 6879.496 | 14105.231 | 10175.851 |
| 223 | 10190.308 | 7941.845 | 7460.83 | 14245.902 | 16057.143 | 18111.532 | 16473.5 | 6151.581 | 6567.12 | 5657.409 | 6395.892 | 6871.375 | 14087.611 | 10171.541 |
| 224 | 10177.94 | 7936.886 | 7452.222 | 14245.902 | 16057.143 | 18101.147 | 16454.809 | 6148.286 | 6567.12 | 5650.884 | 6386.844 | 6863.274 | 14070.114 | 10167.254 |
| 225 | 10165.656 | 7931.933 | 7443.672 | 14240.343 | 16057.143 | 18101.147 | 16436.243 | 6146.091 | 6567.12 | 5644.374 | 6378.947 | 6855.191 | 14052.737 | 10162.99 |
| 226 | 10153.456 | 7926.985 | 7435.179 | 14240.343 | 16057.143 | 18090.774 | 16417.801 | 6142.801 | 6567.12 | 5637.969 | 6371.071 | 6847.128 | 14035.479 | 10158.748 |
| 227 | 10141.338 | 7922.044 | 7426.743 | 14234.789 | 16057.143 | 18090.774 | 16399.481 | 6140.61 | 6567.12 | 5631.577 | 6363.214 | 6839.084 | 14018.34 | 10154.528 |
| 228 | 10129.303 | 7917.11 | 7418.363 | 14229.24 | 16057.143 | 18080.412 | 16381.282 | 6137.326 | 6567.12 | 5625.201 | 6354.258 | 6832.394 | 14001.317 | 10150.33 |
| 229 | 10117.348 | 7910.539 | 7410.038 | 14229.24 | 16057.143 | 18080.412 | 16363.202 | 6135.139 | 6567.12 | 5618.926 | 6346.442 | 6824.385 | 13984.409 | 10146.154 |
| 230 | 10105.472 | 7905.619 | 7401.767 | 14223.694 | 16057.143 | 18070.063 | 16345.24 | 6132.953 | 6567.12 | 5612.666 | 6338.645 | 6816.393 | 13967.615 | 10141.999 |
| 231 | 10093.676 | 7900.705 | 7393.551 | 14223.694 | 16057.143 | 18070.063 | 16327.395 | 6129.678 | 6567.12 | 5606.42 | 6330.868 | 6809.748 | 13950.933 | 10137.866 |
| 232 | 10081.958 | 7895.796 | 7385.388 | 14218.153 | 16057.143 | 18070.063 | 16309.665 | 6127.496 | 6567.12 | 5600.188 | 6323.109 | 6801.792 | 13934.363 | 10133.754 |
| 233 | 10070.317 | 7890.894 | 7377.278 | 14218.153 | 16057.143 | 18059.725 | 16292.049 | 6125.316 | 6567.12 | 5594.057 | 6315.37 | 6793.853 | 13917.903 | 10129.663 |
| 234 | 10058.753 | 7885.998 | 7369.22 | 14212.617 | 16057.143 | 18059.725 | 16274.547 | 6122.048 | 6567.12 | 5587.939 | 6307.649 | 6787.252 | 13901.551 | 10125.592 |
| 235 | 10047.264 | 7881.108 | 7361.214 | 14212.617 | 16057.143 | 18049.4 | 16257.156 | 6119.872 | 6567.12 | 5581.835 | 6299.948 | 6779.348 | 13885.308 | 10121.542 |
| 236 | 10035.849 | 7874.597 | 7353.259 | 14207.084 | 16057.143 | 18049.4 | 16239.875 | 6117.697 | 6567.12 | 5575.831 | 6292.265 | 6771.462 | 13869.17 | 10117.513 |
| 237 | 10024.508 | 7869.721 | 7345.354 | 14207.084 | 16057.143 | 18039.086 | 16222.704 | 6115.524 | 6567.12 | 5569.84 | 6284.601 | 6764.904 | 13853.138 | 10113.503 |
| 238 | 10013.241 | 7864.851 | 7337.5 | 14201.556 | 16057.143 | 18039.086 | 16205.64 | 6113.352 | 6567.12 | 5563.862 | 6276.955 | 6757.052 | 13837.21 | 10109.514 |
| 239 | 10002.045 | 7859.988 | 7329.695 | 14201.556 | 16057.143 | 18028.784 | 16188.684 | 6110.098 | 6567.12 | 5557.983 | 6269.328 | 6750.522 | 13821.384 | 10105.544 |
| 240 | 9990.921 | 7855.13 | 7321.939 | 14196.033 | 16057.143 | 18028.784 | 16177.715 | 6107.93 | 6567.12 | 5552.116 | 6262.806 | 6742.703 | 13805.661 | 10101.594 |
| 241 | 9979.868 | 7850.278 | 7314.231 | 14196.033 | 16057.143 | 18018.493 | 16166.807 | 6105.763 | 6567.12 | 5546.262 | 6255.213 | 6736.201 | 13790.038 | 10097.663 |
| 242 | 9968.884 | 7845.432 | 7306.572 | 14190.513 | 16057.143 | 18018.493 | 16155.959 | 6103.599 | 6567.12 | 5540.42 | 6247.639 | 6728.415 | 13774.514 | 10093.752 |
| 243 | 9957.97 | 7838.98 | 7298.959 | 14190.513 | 16057.143 | 18008.214 | 16145.169 | 6101.435 | 6567.12 | 5534.676 | 6240.083 | 6721.94 | 13759.089 | 10089.86 |
| 244 | 9947.123 | 7834.148 | 7291.394 | 14184.998 | 16057.143 | 18008.214 | 16134.438 | 6099.274 | 6567.12 | 5528.944 | 6233.621 | 6715.478 | 13743.761 | 10085.986 |
| 245 | 9936.345 | 7829.322 | 7283.875 | 14184.998 | 16057.143 | 17997.948 | 16123.765 | 6097.114 | 6567.12 | 5523.224 | 6226.099 | 6707.74 | 13728.53 | 10082.131 |
| 246 | 9925.633 | 7824.502 | 7276.401 | 14179.487 | 16057.143 | 17997.948 | 16113.149 | 6094.955 | 6567.12 | 5517.601 | 6218.595 | 6701.305 | 13713.394 | 10078.295 |
| 247 | 9914.988 | 7819.688 | 7268.974 | 14179.487 | 16057.143 | 17987.692 | 16102.59 | 6092.798 | 6567.12 | 5511.904 | 6212.178 | 6694.882 | 13698.352 | 10074.477 |
| 248 | 9904.408 | 7814.88 | 7261.591 | 14173.981 | 16057.143 | 17987.692 | 16092.087 | 6090.642 | 6567.12 | 5506.304 | 6204.707 | 6687.191 | 13683.404 | 10070.678 |
| 249 | 9893.893 | 7808.478 | 7254.253 | 14173.981 | 16057.143 | 17977.449 | 16081.639 | 6088.488 | 6567.12 | 5500.8 | 6198.318 | 6680.796 | 13668.548 | 10066.896 |
| 250 | 9883.442 | 7803.684 | 7246.958 | 14168.478 | 16057.143 | 17977.449 | 16071.247 | 6086.336 | 6567.12 | 5495.222 | 6190.881 | 6674.412 | 13653.783 | 10063.133 |
| 251 | 9873.055 | 7798.895 | 7239.708 | 14168.478 | 16057.143 | 17967.217 | 16060.91 | 6085.26 | 6567.12 | 5489.74 | 6184.521 | 6668.041 | 13639.109 | 10059.387 |
| 252 | 9862.73 | 7794.113 | 7232.5 | 14162.98 | 16057.143 | 17967.217 | 16050.627 | 6083.11 | 6567.12 | 5484.269 | 6177.116 | 6660.412 | 13624.524 | 10055.659 |
| 253 | 9852.468 | 7789.336 | 7225.335 | 14162.98 | 16057.143 | 17956.997 | 16040.397 | 6080.961 | 6567.12 | 5478.808 | 6170.784 | 6654.067 | 13610.027 | 10051.948 |
| 254 | 9842.267 | 7784.565 | 7218.212 | 14157.486 | 16057.143 | 17956.997 | 16030.221 | 6078.814 | 6567.12 | 5473.443 | 6163.413 | 6647.735 | 13595.618 | 10048.255 |
| 255 | 9832.127 | 7779.8 | 7211.132 | 14157.486 | 16057.143 | 17946.788 | 16020.097 | 6076.668 | 6567.12 | 5468.087 | 6157.109 | 6641.415 | 13581.296 | 10044.579 |
| 256 | 9822.047 | 7773.456 | 7204.092 | 14151.997 | 16057.143 | 17946.788 | 16010.025 | 6074.524 | 6567.12 | 5462.743 | 6149.77 | 6635.106 | 13567.06 | 10040.919 |
| 257 | 9812.027 | 7768.704 | 7197.094 | 14151.997 | 16057.143 | 17936.591 | 16000.005 | 6072.381 | 6567.12 | 5457.408 | 6143.494 | 6628.81 | 13552.908 | 10037.277 |
| 258 | 9802.066 | 7763.958 | 7190.136 | 14146.512 | 16057.143 | 17936.591 | 15990.037 | 6071.31 | 6567.12 | 5452.168 | 6137.23 | 6621.27 | 13538.841 | 10033.651 |
| 259 | 9792.164 | 7759.219 | 7183.218 | 14146.512 | 16057.143 | 17926.405 | 15980.119 | 6069.17 | 6567.12 | 5446.937 | 6129.939 | 6615 | 13524.857 | 10030.042 |
| 260 | 9782.319 | 7754.484 | 7176.34 | 14141.031 | 16057.143 | 17926.405 | 15970.251 | 6067.031 | 6567.12 | 5441.716 | 6123.703 | 6608.742 | 13510.955 | 10026.45 |
| 261 | 9772.532 | 7749.756 | 7169.502 | 14141.031 | 16057.143 | 17916.232 | 15960.433 | 6064.893 | 6567.12 | 5436.505 | 6117.48 | 6602.495 | 13497.135 | 10022.873 |
| 262 | 9762.801 | 7745.034 | 7162.702 | 14135.554 | 16057.143 | 17916.232 | 15950.665 | 6063.825 | 6567.12 | 5431.387 | 6110.235 | 6596.261 | 13483.395 | 10019.313 |
| 263 | 9753.127 | 7738.746 | 7155.941 | 14135.554 | 16057.143 | 17906.069 | 15940.946 | 6061.69 | 6567.12 | 5426.196 | 6104.039 | 6590.038 | 13469.736 | 10015.769 |
| 264 | 9743.508 | 7734.037 | 7149.218 | 14130.081 | 16057.143 | 17906.069 | 15931.275 | 6059.556 | 6567.12 | 5421.097 | 6097.856 | 6583.827 | 13456.155 | 10012.241 |
| 265 | 9733.944 | 7729.333 | 7142.534 | 14130.081 | 16057.143 | 17895.918 | 15921.652 | 6058.49 | 6567.12 | 5416.09 | 6091.685 | 6577.627 | 13442.653 | 10008.728 |
| 266 | 9724.435 | 7724.635 | 7135.886 | 14124.613 | 16057.143 | 17895.918 | 15912.077 | 6056.359 | 6567.12 | 5411.01 | 6085.527 | 6571.439 | 13429.229 | 10005.231 |
| 267 | 9714.98 | 7719.943 | 7129.276 | 14124.613 | 16057.143 | 17895.918 | 15902.549 | 6054.229 | 6567.12 | 5406.021 | 6079.381 | 6565.263 | 13415.881 | 10001.75 |
| 268 | 9705.579 | 7715.257 | 7122.703 | 14119.149 | 16057.143 | 17885.779 | 15893.068 | 6053.165 | 6567.12 | 5401.042 | 6072.226 | 6559.099 | 13402.61 | 9998.284 |
| 269 | 9696.23 | 7709.017 | 7116.166 | 14119.149 | 16057.143 | 17885.779 | 15883.633 | 6051.037 | 6567.12 | 5396.072 | 6066.107 | 6554.175 | 13389.413 | 9994.833 |
| 270 | 9686.934 | 7704.344 | 7109.665 | 14113.689 | 16057.143 | 17875.651 | 15874.244 | 6048.911 | 6567.12 | 5391.11 | 6060 | 6548.031 | 13376.292 | 9991.397 |
| 271 | 9677.689 | 7699.677 | 7103.2 | 14113.689 | 16057.143 | 17875.651 | 15864.901 | 6047.848 | 6567.12 | 5386.239 | 6053.905 | 6541.899 | 13363.244 | 9987.977 |
| 272 | 9668.497 | 7695.015 | 7096.77 | 14113.689 | 16057.143 | 17865.535 | 15855.603 | 6045.724 | 6567.12 | 5381.377 | 6047.823 | 6535.778 | 13350.269 | 9984.571 |
| 273 | 9659.355 | 7690.359 | 7090.375 | 14108.233 | 16057.143 | 17865.535 | 15846.35 | 6044.663 | 6567.12 | 5376.524 | 6041.753 | 6529.669 | 13337.367 | 9981.18 |
| 274 | 9650.263 | 7685.709 | 7084.016 | 14108.233 | 16057.143 | 17855.43 | 15837.142 | 6042.541 | 6567.12 | 5371.679 | 6035.695 | 6523.571 | 13324.537 | 9977.804 |
| 275 | 9641.222 | 7681.064 | 7077.69 | 14102.782 | 16057.143 | 17855.43 | 15827.977 | 6040.421 | 6567.12 | 5366.924 | 6029.649 | 6518.701 | 13311.777 | 9974.442 |
| 276 | 9632.23 | 7674.879 | 7071.399 | 14102.782 | 16057.143 | 17845.336 | 15818.856 | 6039.362 | 6567.12 | 5362.096 | 6023.616 | 6512.624 | 13299.088 | 9971.094 |
| 277 | 9623.287 | 7670.247 | 7065.141 | 14097.335 | 16057.143 | 17845.336 | 15809.779 | 6037.244 | 6567.12 | 5357.358 | 6018.597 | 6506.557 | 13286.469 | 9967.761 |
| 278 | 9614.393 | 7665.621 | 7058.917 | 14097.335 | 16057.143 | 17835.254 | 15800.744 | 6036.185 | 6567.12 | 5352.628 | 6012.585 | 6500.503 | 13273.919 | 9964.442 |
| 279 | 9605.547 | 7661.001 | 7052.726 | 14091.892 | 16057.143 | 17835.254 | 15791.752 | 6034.069 | 6567.12 | 5347.986 | 6006.586 | 6495.667 | 13261.438 | 9961.137 |
| 280 | 9596.749 | 7656.386 | 7046.568 | 14091.892 | 16057.143 | 17825.184 | 15782.803 | 6033.012 | 6567.12 | 5343.272 | 6000.598 | 6489.632 | 13249.024 | 9957.846 |
| 281 | 9587.998 | 7651.776 | 7040.443 | 14091.892 | 16057.143 | 17825.184 | 15773.895 | 6030.899 | 6567.12 | 5338.647 | 5994.622 | 6483.609 | 13236.678 | 9954.569 |
| 282 | 9579.294 | 7647.172 | 7034.349 | 14086.453 | 16057.143 | 17815.124 | 15765.028 | 6029.842 | 6567.12 | 5334.029 | 5988.659 | 6478.798 | 13224.398 | 9951.306 |
| 283 | 9570.636 | 7641.042 | 7028.288 | 14086.453 | 16057.143 | 17815.124 | 15756.203 | 6027.731 | 6567.12 | 5329.42 | 5983.698 | 6472.795 | 13212.184 | 9948.056 |
| 284 | 9562.024 | 7636.451 | 7022.259 | 14081.019 | 16057.143 | 17805.076 | 15747.419 | 6026.676 | 6567.12 | 5324.818 | 5977.756 | 6466.802 | 13200.035 | 9944.82 |
| 285 | 9553.458 | 7631.865 | 7016.26 | 14081.019 | 16057.143 | 17805.076 | 15738.675 | 6024.567 | 6567.12 | 5320.303 | 5971.825 | 6462.017 | 13187.951 | 9941.598 |
| 286 | 9544.937 | 7627.285 | 7010.293 | 14075.588 | 16057.143 | 17795.039 | 15729.972 | 6023.513 | 6567.12 | 5315.797 | 5965.907 | 6456.044 | 13175.932 | 9938.388 |
| 287 | 9536.46 | 7622.711 | 7004.357 | 14075.588 | 16057.143 | 17795.039 | 15721.308 | 6021.406 | 6567.12 | 5311.297 | 5960.984 | 6451.274 | 13163.976 | 9935.192 |
| 288 | 9528.028 | 7618.142 | 6998.451 | 14070.162 | 16057.143 | 17785.014 | 15712.684 | 6020.353 | 6567.12 | 5306.806 | 5955.087 | 6445.322 | 13152.082 | 9932.009 |
| 289 | 9519.64 | 7612.058 | 6992.576 | 14070.162 | 16057.143 | 17785.014 | 15704.098 | 6019.301 | 6567.12 | 5302.321 | 5949.201 | 6439.381 | 13140.252 | 9928.839 |
| 290 | 9511.296 | 7607.502 | 6986.731 | 14070.162 | 16057.143 | 17775 | 15695.552 | 6017.197 | 6567.12 | 5297.923 | 5944.305 | 6434.635 | 13128.483 | 9925.682 |
| 291 | 9502.995 | 7602.951 | 6980.915 | 14064.74 | 16057.143 | 17775 | 15687.045 | 6016.145 | 6567.12 | 5293.533 | 5938.441 | 6428.713 | 13116.776 | 9922.538 |
| 292 | 9494.736 | 7598.406 | 6975.129 | 14064.74 | 16057.143 | 17764.997 | 15678.575 | 6014.044 | 6567.12 | 5289.149 | 5932.589 | 6423.984 | 13105.129 | 9919.406 |
| 293 | 9486.52 | 7593.866 | 6969.372 | 14059.322 | 16057.143 | 17764.997 | 15670.144 | 6012.993 | 6567.12 | 5284.773 | 5927.72 | 6418.082 | 13093.542 | 9916.287 |
| 294 | 9478.346 | 7589.331 | 6963.645 | 14059.322 | 16057.143 | 17755.006 | 15661.75 | 6011.943 | 6567.12 | 5280.404 | 5921.889 | 6413.368 | 13082.016 | 9913.181 |
| 295 | 9470.213 | 7584.802 | 6957.946 | 14053.908 | 16057.143 | 17755.006 | 15653.394 | 6009.845 | 6567.12 | 5276.12 | 5917.038 | 6407.485 | 13070.548 | 9910.087 |
| 296 | 9462.122 | 7578.772 | 6952.275 | 14053.908 | 16057.143 | 17745.025 | 15645.074 | 6008.796 | 6567.12 | 5271.765 | 5911.227 | 6402.786 | 13059.139 | 9907.005 |
| 297 | 9454.072 | 7574.255 | 6946.633 | 14053.908 | 16057.143 | 17745.025 | 15636.792 | 6006.699 | 6567.12 | 5267.495 | 5906.394 | 6398.095 | 13047.789 | 9903.936 |
| 298 | 9446.062 | 7569.744 | 6941.018 | 14048.499 | 16057.143 | 17735.056 | 15628.546 | 6005.651 | 6567.12 | 5263.232 | 5900.604 | 6392.24 | 13036.495 | 9900.879 |
| 299 | 9438.093 | 7565.238 | 6935.432 | 14048.499 | 16057.143 | 17735.056 | 15620.336 | 6004.604 | 6567.12 | 5258.976 | 5895.788 | 6387.564 | 13025.26 | 9897.834 |